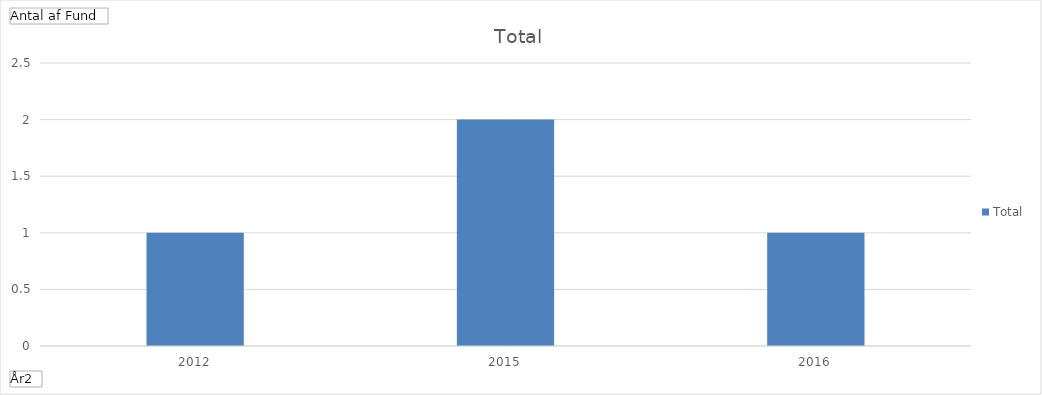
| Category | Total |
|---|---|
| 2012 | 1 |
| 2015 | 2 |
| 2016 | 1 |